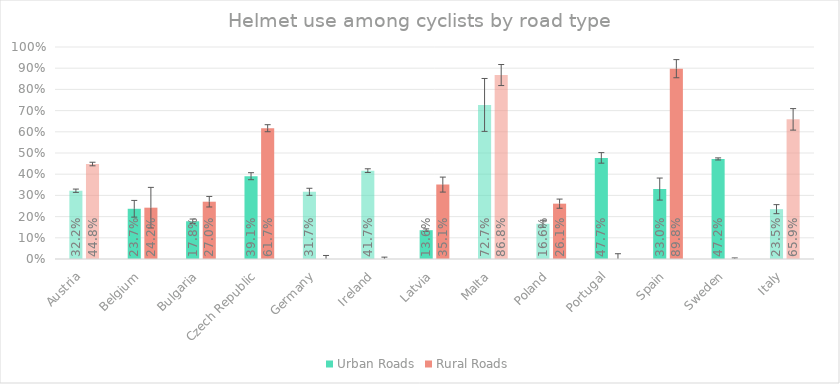
| Category | Urban Roads | Rural Roads |
|---|---|---|
| Austria | 0.322 | 0.448 |
| Belgium | 0.237 | 0.242 |
| Bulgaria | 0.178 | 0.27 |
| Czech Republic | 0.391 | 0.617 |
| Germany | 0.317 | 0 |
| Ireland | 0.417 | 0 |
| Latvia | 0.136 | 0.351 |
| Malta | 0.727 | 0.868 |
| Poland | 0.166 | 0.261 |
| Portugal | 0.477 | 0 |
| Spain | 0.33 | 0.898 |
| Sweden | 0.472 | 0 |
| Italy | 0.235 | 0.659 |